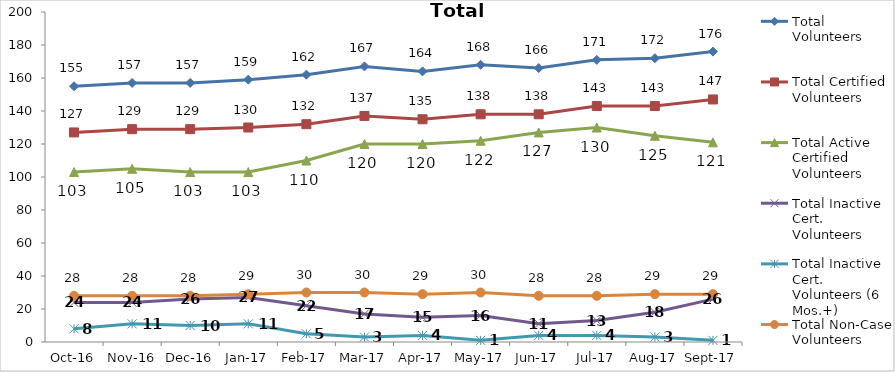
| Category | Total Volunteers | Total Certified Volunteers | Total Active Certified Volunteers | Total Inactive Cert. Volunteers | Total Inactive Cert. Volunteers (6 Mos.+) | Total Non-Case Volunteers |
|---|---|---|---|---|---|---|
| 2016-10-01 | 155 | 127 | 103 | 24 | 8 | 28 |
| 2016-11-01 | 157 | 129 | 105 | 24 | 11 | 28 |
| 2016-12-01 | 157 | 129 | 103 | 26 | 10 | 28 |
| 2017-01-01 | 159 | 130 | 103 | 27 | 11 | 29 |
| 2017-02-01 | 162 | 132 | 110 | 22 | 5 | 30 |
| 2017-03-01 | 167 | 137 | 120 | 17 | 3 | 30 |
| 2017-04-01 | 164 | 135 | 120 | 15 | 4 | 29 |
| 2017-05-01 | 168 | 138 | 122 | 16 | 1 | 30 |
| 2017-06-01 | 166 | 138 | 127 | 11 | 4 | 28 |
| 2017-07-01 | 171 | 143 | 130 | 13 | 4 | 28 |
| 2017-08-01 | 172 | 143 | 125 | 18 | 3 | 29 |
| 2017-09-01 | 176 | 147 | 121 | 26 | 1 | 29 |